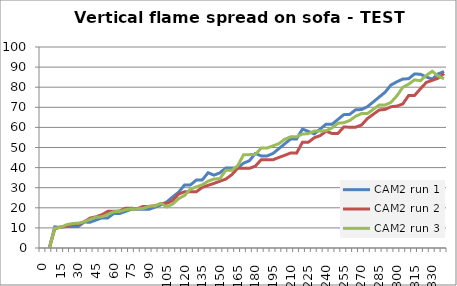
| Category | CAM2 run 1 | CAM2 run 2 | CAM2 run 3 |
|---|---|---|---|
| 0.0 | -1 | -1 | -1 |
| 5.0 | -1 | -1 | -1 |
| 10.0 | 10.543 | 9.471 | 9.884 |
| 15.0 | 10.156 | 10.516 | 10.199 |
| 20.0 | 10.759 | 10.975 | 11.602 |
| 25.0 | 10.759 | 11.712 | 12.189 |
| 30.0 | 10.759 | 11.712 | 12.327 |
| 35.0 | 12.891 | 13.078 | 13.059 |
| 40.0 | 12.846 | 14.885 | 14.218 |
| 45.0 | 13.917 | 15.527 | 15.379 |
| 50.0 | 14.987 | 16.582 | 15.543 |
| 55.0 | 14.987 | 18.229 | 16.708 |
| 60.0 | 17.128 | 18.229 | 18.043 |
| 65.0 | 17.128 | 18.44 | 18.212 |
| 70.0 | 18.199 | 19.779 | 19.079 |
| 75.0 | 19.27 | 19.779 | 19.431 |
| 80.0 | 19.27 | 19.524 | 19.431 |
| 85.0 | 19.27 | 20.698 | 19.725 |
| 90.0 | 19.27 | 20.698 | 20.785 |
| 95.0 | 20.34 | 21.01 | 20.898 |
| 100.0 | 21.437 | 22.092 | 22.222 |
| 105.0 | 22.936 | 22.219 | 20.416 |
| 110.0 | 25.43 | 23.609 | 21.892 |
| 115.0 | 27.753 | 26.811 | 24.56 |
| 120.0 | 31.366 | 27.986 | 26.108 |
| 125.0 | 31.366 | 27.986 | 29.308 |
| 130.0 | 33.775 | 27.986 | 30.379 |
| 135.0 | 33.84 | 30.116 | 31.452 |
| 140.0 | 37.448 | 31.181 | 33.242 |
| 145.0 | 36.245 | 32.155 | 34.331 |
| 150.0 | 37.39 | 33.224 | 34.489 |
| 155.0 | 39.781 | 34.294 | 38.693 |
| 160.0 | 39.8 | 36.433 | 38.693 |
| 165.0 | 39.8 | 39.643 | 40.876 |
| 170.0 | 42.21 | 39.643 | 46.34 |
| 175.0 | 43.415 | 39.643 | 46.457 |
| 180.0 | 47.03 | 40.713 | 46.457 |
| 185.0 | 45.825 | 43.924 | 49.73 |
| 190.0 | 45.809 | 43.924 | 49.73 |
| 195.0 | 47.03 | 43.924 | 50.822 |
| 200.0 | 49.44 | 45.06 | 51.914 |
| 205.0 | 51.85 | 46.129 | 54.099 |
| 210.0 | 54.261 | 47.285 | 55.312 |
| 215.0 | 54.261 | 47.198 | 55.312 |
| 220.0 | 59.18 | 52.623 | 56.701 |
| 225.0 | 57.977 | 52.623 | 56.882 |
| 230.0 | 56.774 | 54.855 | 58.161 |
| 235.0 | 59.18 | 55.922 | 58.161 |
| 240.0 | 61.587 | 58.055 | 58.379 |
| 245.0 | 61.528 | 56.989 | 59.687 |
| 250.0 | 63.937 | 56.989 | 62.074 |
| 255.0 | 66.346 | 60.19 | 62.336 |
| 260.0 | 66.477 | 60.102 | 63.401 |
| 265.0 | 68.756 | 60.102 | 65.534 |
| 270.0 | 68.882 | 61.171 | 66.865 |
| 275.0 | 70.292 | 64.379 | 66.865 |
| 280.0 | 72.691 | 66.518 | 68.996 |
| 285.0 | 75.09 | 68.657 | 71.131 |
| 290.0 | 77.49 | 68.936 | 71.131 |
| 295.0 | 81.091 | 70.268 | 72.459 |
| 300.0 | 82.689 | 70.598 | 75.659 |
| 305.0 | 84.048 | 71.655 | 79.939 |
| 310.0 | 84.23 | 75.885 | 81.516 |
| 315.0 | 86.611 | 75.885 | 83.649 |
| 320.0 | 86.435 | 79.231 | 83.245 |
| 325.0 | 85.079 | 82.376 | 85.924 |
| 330.0 | 84.048 | 83.421 | 87.924 |
| 335.0 | 86.611 | 84.467 | 85.538 |
| 340.0 | 87.803 | 86.794 | 84.231 |